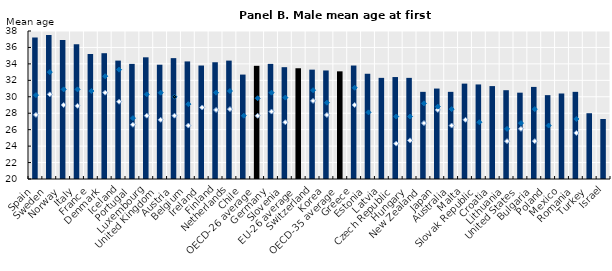
| Category | 2020 |
|---|---|
| Spain | 37.2 |
| Sweden | 37.5 |
| Norway | 36.9 |
| Italy | 36.4 |
| France | 35.2 |
| Denmark | 35.3 |
| Iceland | 34.4 |
| Portugal | 34 |
| Luxembourg | 34.8 |
| United Kingdom | 33.9 |
| Austria | 34.7 |
| Belgium | 34.3 |
| Ireland | 33.8 |
| Finland | 34.2 |
| Netherlands | 34.4 |
| Chile | 32.7 |
| OECD-26 average | 33.765 |
| Germany | 34 |
| Slovenia | 33.6 |
| EU-26 average | 33.469 |
| Switzerland | 33.3 |
| Korea | 33.2 |
| OECD-35 average | 33.094 |
| Greece | 33.8 |
| Estonia | 32.8 |
| Latvia | 32.3 |
| Czech Republic | 32.4 |
| Hungary | 32.3 |
| New Zealand | 30.6 |
| Japan | 31 |
| Australia | 30.6 |
| Malta | 31.6 |
| Slovak Republic | 31.5 |
| Croatia | 31.3 |
| Lithuania | 30.8 |
| United States | 30.5 |
| Bulgaria | 31.2 |
| Poland | 30.2 |
| Mexico | 30.4 |
| Romania | 30.6 |
| Turkey | 28 |
| Israel | 27.3 |